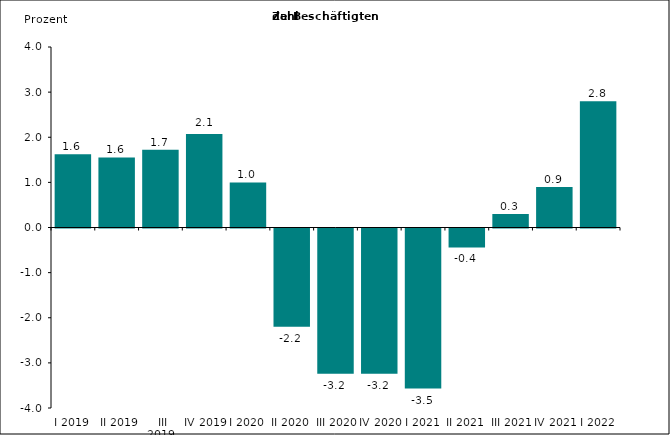
| Category | Series 0 |
|---|---|
| I 2019 | 1.626 |
|  II 2019 | 1.554 |
|  III 2019 | 1.726 |
| IV 2019 | 2.07 |
| I 2020 | 1 |
| II 2020 | -2.176 |
| III 2020 | -3.218 |
| IV 2020 | -3.22 |
| I 2021 | -3.546 |
| II 2021 | -0.419 |
| III 2021 | 0.3 |
| IV 2021 | 0.9 |
| I 2022 | 2.8 |